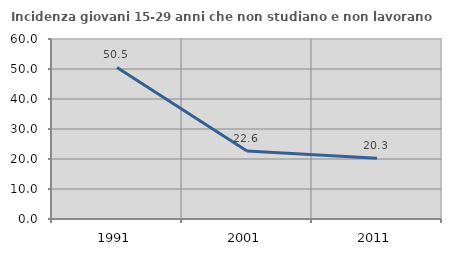
| Category | Incidenza giovani 15-29 anni che non studiano e non lavorano  |
|---|---|
| 1991.0 | 50.513 |
| 2001.0 | 22.642 |
| 2011.0 | 20.29 |